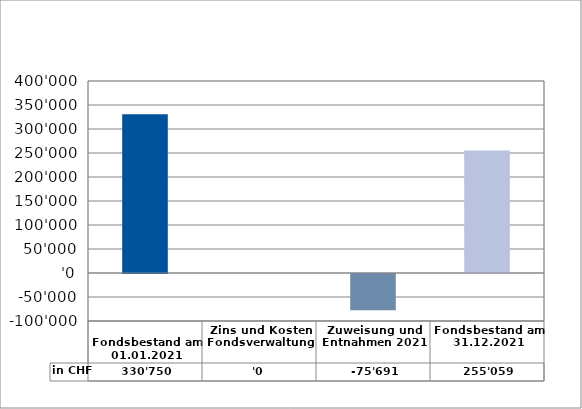
| Category | in CHF |
|---|---|
| 
Fondsbestand am 01.01.2021

 | 330750 |
| Zins und Kosten Fondsverwaltung | 0 |
| Zuweisung und Entnahmen 2021 | -75691 |
| Fondsbestand am 31.12.2021 | 255059 |